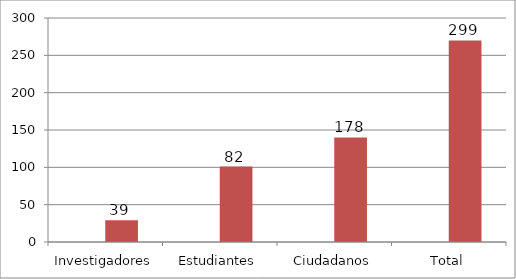
| Category | Series 0 | Series 1 |
|---|---|---|
| Investigadores |  | 29 |
| Estudiantes |  | 101 |
| Ciudadanos |  | 140 |
| Total |  | 270 |